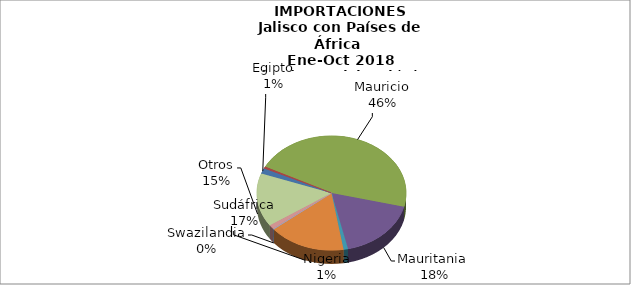
| Category | IMPORTACIONES |
|---|---|
| Egipto | 1.346 |
| Marruecos | 0.424 |
| Mauricio | 41.66 |
| Mauritania  | 15.822 |
| Nigeria | 0.882 |
| Sudáfrica | 14.929 |
| Swazilandia | 0.182 |
| Túnez | 1.123 |
| Otros | 13.565 |